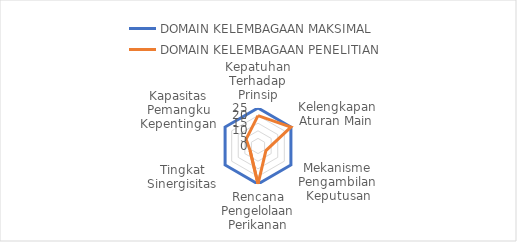
| Category | DOMAIN KELEMBAGAAN MAKSIMAL  | DOMAIN KELEMBAGAAN PENELITIAN  |
|---|---|---|
| Kepatuhan Terhadap Prinsip | 25 | 20 |
| Kelengkapan Aturan Main  | 25 | 25 |
| Mekanisme Pengambilan Keputusan | 25 | 6 |
| Rencana Pengelolaan Perikanan | 25 | 25 |
| Tingkat Sinergisitas | 25 | 6 |
| Kapasitas Pemangku Kepentingan | 25 | 9 |